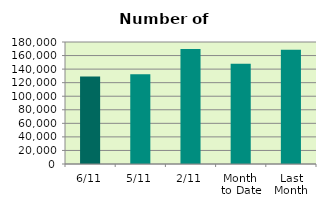
| Category | Series 0 |
|---|---|
| 6/11 | 129184 |
| 5/11 | 132400 |
| 2/11 | 169802 |
| Month 
to Date | 147962 |
| Last
Month | 168717.043 |